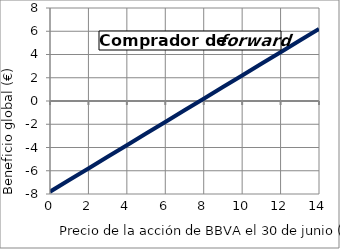
| Category | Comprador |
|---|---|
| 0.0 | -7.8 |
| 1.0 | -6.8 |
| 2.0 | -5.8 |
| 3.0 | -4.8 |
| 4.0 | -3.8 |
| 5.0 | -2.8 |
| 6.0 | -1.8 |
| 7.0 | -0.8 |
| 8.0 | 0.2 |
| 9.0 | 1.2 |
| 10.0 | 2.2 |
| 11.0 | 3.2 |
| 12.0 | 4.2 |
| 13.0 | 5.2 |
| 14.0 | 6.2 |